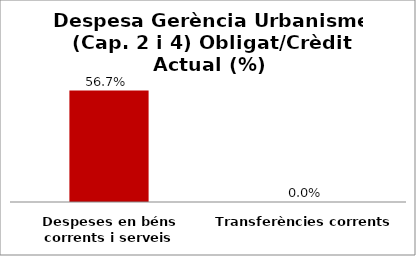
| Category | Series 0 |
|---|---|
| Despeses en béns corrents i serveis | 0.567 |
| Transferències corrents | 0 |